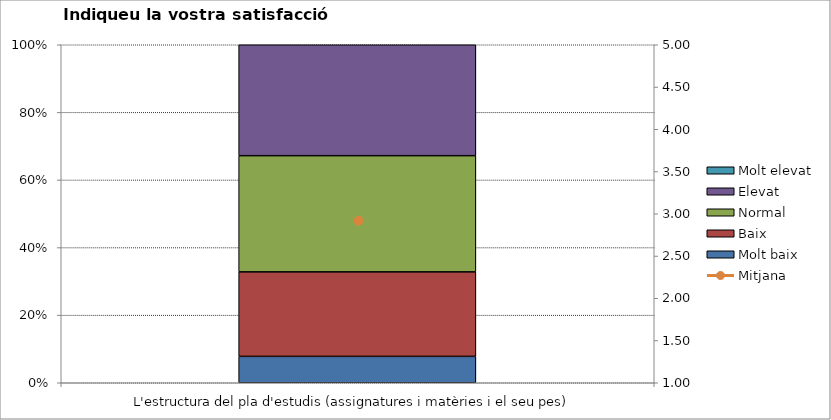
| Category | Molt baix | Baix | Normal  | Elevat | Molt elevat |
|---|---|---|---|---|---|
| L'estructura del pla d'estudis (assignatures i matèries i el seu pes) | 5 | 16 | 22 | 21 | 0 |